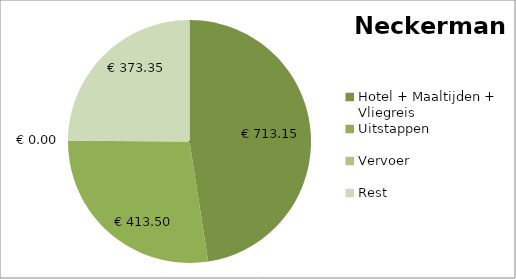
| Category | Series 0 |
|---|---|
| Hotel + Maaltijden + Vliegreis | 713.15 |
| Uitstappen | 413.5 |
| Vervoer | 0 |
| Rest | 373.35 |